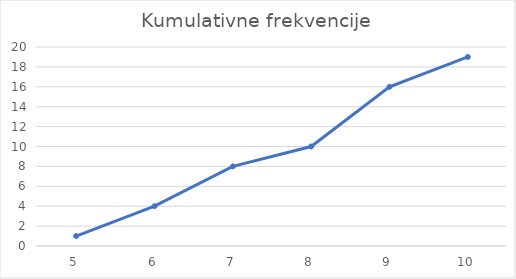
| Category | Kumulativne frekvencije |
|---|---|
| 5.0 | 1 |
| 6.0 | 4 |
| 7.0 | 8 |
| 8.0 | 10 |
| 9.0 | 16 |
| 10.0 | 19 |